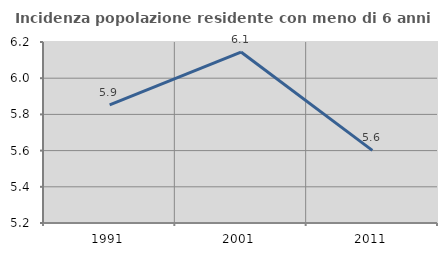
| Category | Incidenza popolazione residente con meno di 6 anni |
|---|---|
| 1991.0 | 5.852 |
| 2001.0 | 6.145 |
| 2011.0 | 5.601 |